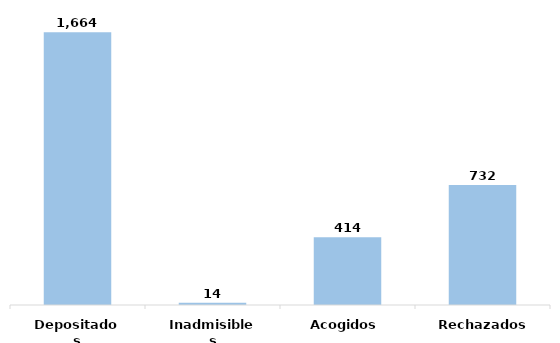
| Category | Series 0 |
|---|---|
| Depositados | 1664 |
| Inadmisibles | 14 |
| Acogidos | 414 |
| Rechazados | 732 |